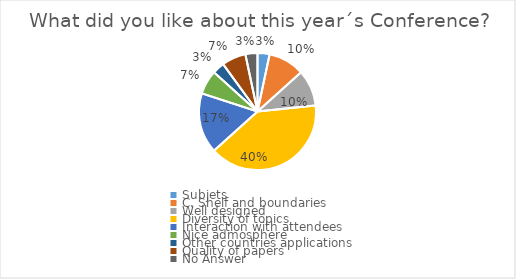
| Category | Series 0 |
|---|---|
| Subjets  | 1 |
| C. Shelf and boundaries | 3 |
| Well designed | 3 |
| Diversity of topics | 12 |
| Interaction with attendees | 5 |
| Nice admosphere | 2 |
| Other countries applications | 1 |
| Quality of papers | 2 |
| No Answer | 1 |